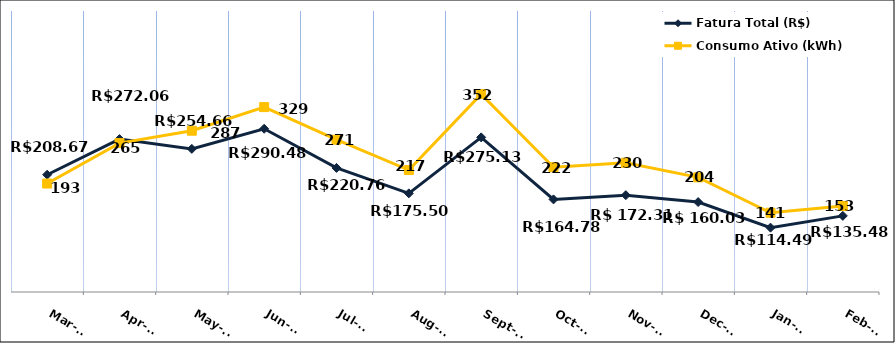
| Category | Fatura Total (R$) |
|---|---|
| 2022-03-01 | 208.67 |
| 2022-04-01 | 272.06 |
| 2022-05-01 | 254.66 |
| 2022-06-01 | 290.48 |
| 2022-07-01 | 220.76 |
| 2022-08-01 | 175.5 |
| 2022-09-01 | 275.13 |
| 2022-10-01 | 164.78 |
| 2022-11-01 | 172.31 |
| 2022-12-01 | 160.03 |
| 2023-01-01 | 114.49 |
| 2023-02-01 | 135.48 |